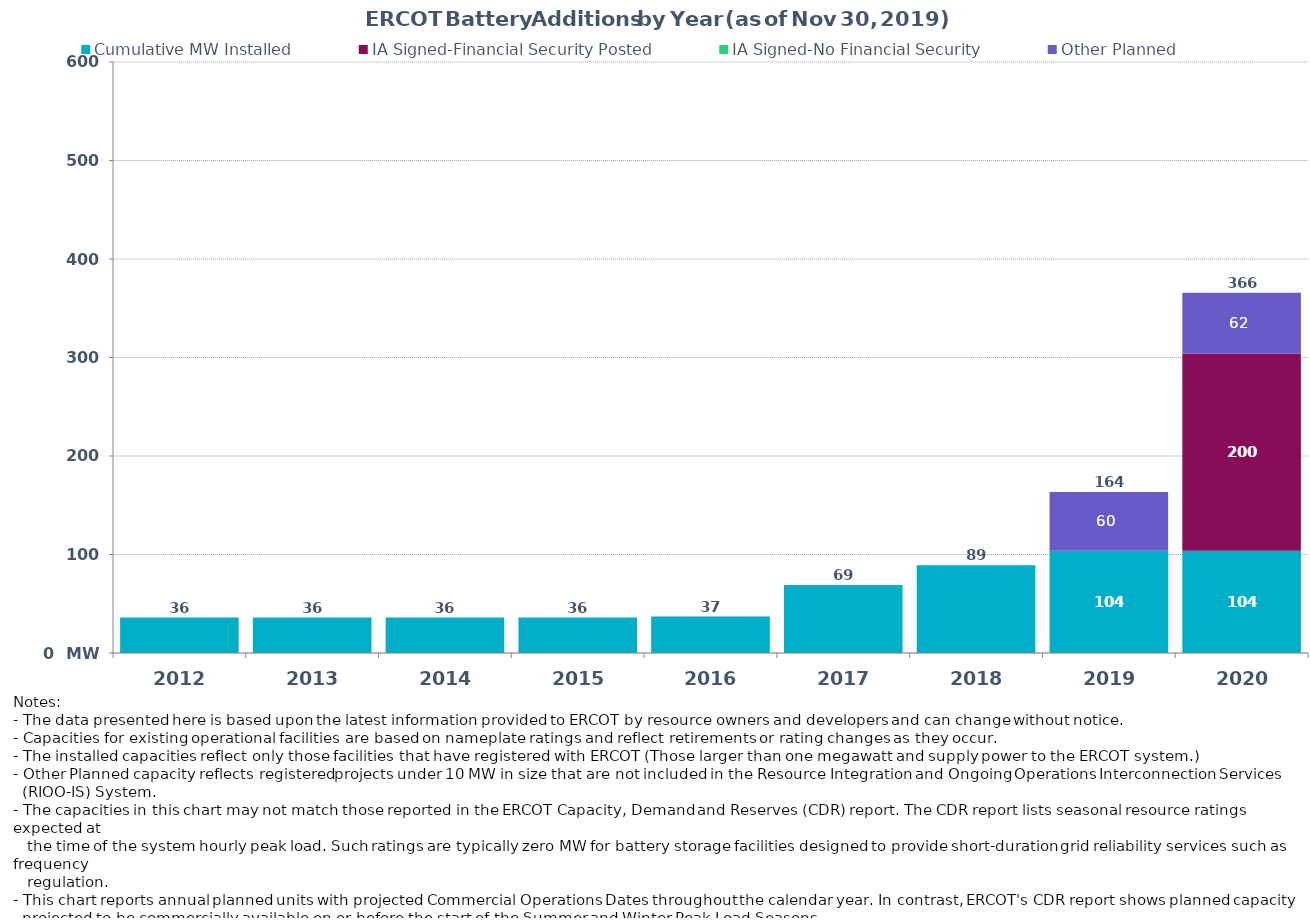
| Category | Cumulative MW Installed | IA Signed-Financial Security Posted  | IA Signed-No Financial Security  | Other Planned | Cumulative Installed and Planned |
|---|---|---|---|---|---|
| 2012.0 | 36 | 0 | 0 | 0 | 36 |
| 2013.0 | 36 | 0 | 0 | 0 | 36 |
| 2014.0 | 36 | 0 | 0 | 0 | 36 |
| 2015.0 | 36 | 0 | 0 | 0 | 36 |
| 2016.0 | 37 | 0 | 0 | 0 | 37 |
| 2017.0 | 69 | 0 | 0 | 0 | 69 |
| 2018.0 | 89 | 0 | 0 | 0 | 89 |
| 2019.0 | 103.9 | 0 | 0 | 59.5 | 164 |
| 2020.0 | 103.9 | 200 | 0 | 61.75 | 365.65 |